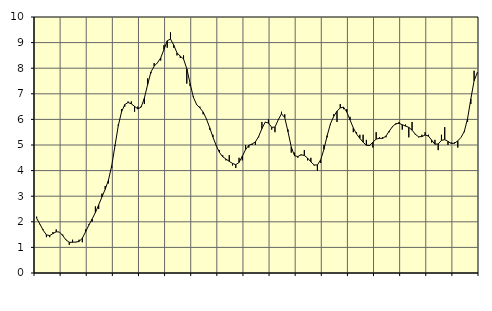
| Category | Piggar | Series 1 |
|---|---|---|
| nan | 2.2 | 2.14 |
| 87.0 | 1.9 | 1.91 |
| 87.0 | 1.7 | 1.67 |
| 87.0 | 1.4 | 1.49 |
| nan | 1.4 | 1.46 |
| 88.0 | 1.6 | 1.54 |
| 88.0 | 1.7 | 1.61 |
| 88.0 | 1.6 | 1.6 |
| nan | 1.5 | 1.46 |
| 89.0 | 1.3 | 1.29 |
| 89.0 | 1.1 | 1.2 |
| 89.0 | 1.3 | 1.2 |
| nan | 1.2 | 1.21 |
| 90.0 | 1.3 | 1.23 |
| 90.0 | 1.2 | 1.36 |
| 90.0 | 1.7 | 1.61 |
| nan | 1.9 | 1.87 |
| 91.0 | 2 | 2.11 |
| 91.0 | 2.6 | 2.36 |
| 91.0 | 2.5 | 2.66 |
| nan | 3.1 | 2.97 |
| 92.0 | 3.4 | 3.27 |
| 92.0 | 3.5 | 3.63 |
| 92.0 | 4.1 | 4.19 |
| nan | 5 | 4.97 |
| 93.0 | 5.8 | 5.75 |
| 93.0 | 6.4 | 6.29 |
| 93.0 | 6.5 | 6.58 |
| nan | 6.7 | 6.66 |
| 94.0 | 6.7 | 6.61 |
| 94.0 | 6.3 | 6.51 |
| 94.0 | 6.5 | 6.41 |
| nan | 6.5 | 6.48 |
| 95.0 | 6.6 | 6.83 |
| 95.0 | 7.6 | 7.36 |
| 95.0 | 7.8 | 7.85 |
| nan | 8.2 | 8.08 |
| 96.0 | 8.2 | 8.21 |
| 96.0 | 8.3 | 8.4 |
| 96.0 | 8.9 | 8.73 |
| nan | 8.8 | 9.07 |
| 97.0 | 9.4 | 9.14 |
| 97.0 | 8.8 | 8.9 |
| 97.0 | 8.5 | 8.6 |
| nan | 8.4 | 8.47 |
| 98.0 | 8.5 | 8.36 |
| 98.0 | 7.4 | 7.98 |
| 98.0 | 7.3 | 7.41 |
| nan | 6.9 | 6.87 |
| 99.0 | 6.6 | 6.58 |
| 99.0 | 6.5 | 6.45 |
| 99.0 | 6.2 | 6.29 |
| nan | 6 | 6.02 |
| 0.0 | 5.6 | 5.68 |
| 0.0 | 5.4 | 5.31 |
| 0.0 | 5 | 4.98 |
| nan | 4.8 | 4.71 |
| 1.0 | 4.6 | 4.54 |
| 1.0 | 4.4 | 4.45 |
| 1.0 | 4.6 | 4.36 |
| nan | 4.2 | 4.28 |
| 2.0 | 4.1 | 4.23 |
| 2.0 | 4.5 | 4.32 |
| 2.0 | 4.4 | 4.56 |
| nan | 5 | 4.82 |
| 3.0 | 4.9 | 4.99 |
| 3.0 | 5 | 5.04 |
| 3.0 | 5 | 5.12 |
| nan | 5.3 | 5.33 |
| 4.0 | 5.9 | 5.64 |
| 4.0 | 5.9 | 5.89 |
| 4.0 | 6 | 5.86 |
| nan | 5.6 | 5.69 |
| 5.0 | 5.5 | 5.7 |
| 5.0 | 6 | 5.98 |
| 5.0 | 6.3 | 6.22 |
| nan | 6.2 | 6.07 |
| 6.0 | 5.6 | 5.52 |
| 6.0 | 4.7 | 4.92 |
| 6.0 | 4.7 | 4.58 |
| nan | 4.5 | 4.55 |
| 7.0 | 4.6 | 4.62 |
| 7.0 | 4.8 | 4.59 |
| 7.0 | 4.4 | 4.49 |
| nan | 4.5 | 4.34 |
| 8.0 | 4.2 | 4.22 |
| 8.0 | 4 | 4.22 |
| 8.0 | 4.3 | 4.42 |
| nan | 5 | 4.83 |
| 9.0 | 5.3 | 5.37 |
| 9.0 | 5.8 | 5.83 |
| 9.0 | 6.2 | 6.12 |
| nan | 5.9 | 6.32 |
| 10.0 | 6.6 | 6.45 |
| 10.0 | 6.4 | 6.48 |
| 10.0 | 6.4 | 6.29 |
| nan | 6.1 | 5.98 |
| 11.0 | 5.5 | 5.67 |
| 11.0 | 5.5 | 5.43 |
| 11.0 | 5.4 | 5.26 |
| nan | 5.4 | 5.11 |
| 12.0 | 5.2 | 4.99 |
| 12.0 | 5 | 4.98 |
| 12.0 | 4.9 | 5.11 |
| nan | 5.5 | 5.23 |
| 13.0 | 5.3 | 5.26 |
| 13.0 | 5.3 | 5.26 |
| 13.0 | 5.3 | 5.35 |
| nan | 5.5 | 5.54 |
| 14.0 | 5.7 | 5.72 |
| 14.0 | 5.8 | 5.83 |
| 14.0 | 5.9 | 5.85 |
| nan | 5.6 | 5.79 |
| 15.0 | 5.8 | 5.74 |
| 15.0 | 5.3 | 5.69 |
| 15.0 | 5.9 | 5.58 |
| nan | 5.4 | 5.42 |
| 16.0 | 5.3 | 5.32 |
| 16.0 | 5.4 | 5.33 |
| 16.0 | 5.5 | 5.39 |
| nan | 5.4 | 5.35 |
| 17.0 | 5.1 | 5.19 |
| 17.0 | 5.2 | 5.03 |
| 17.0 | 4.8 | 5.04 |
| nan | 5.4 | 5.18 |
| 18.0 | 5.7 | 5.21 |
| 18.0 | 5 | 5.14 |
| 18.0 | 5.1 | 5.06 |
| nan | 5.1 | 5.07 |
| 19.0 | 4.9 | 5.16 |
| 19.0 | 5.3 | 5.3 |
| 19.0 | 5.5 | 5.53 |
| nan | 5.9 | 6.03 |
| 20.0 | 6.6 | 6.8 |
| 20.0 | 7.9 | 7.51 |
| 20.0 | 7.8 | 7.83 |